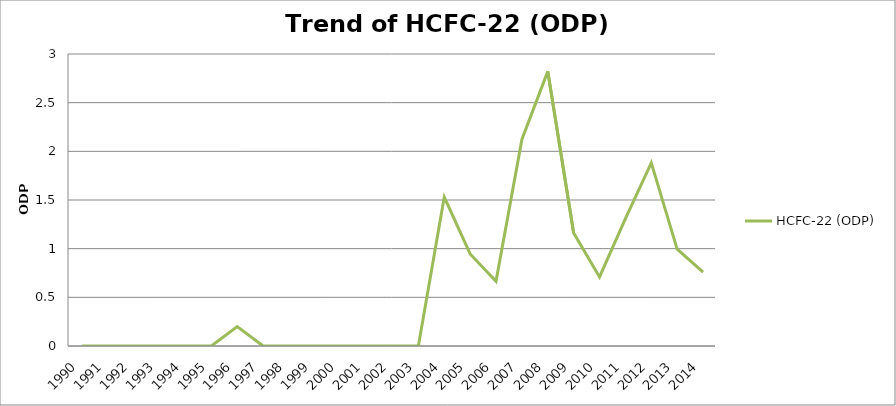
| Category | HCFC-22 (ODP) |
|---|---|
| 1990.0 | 0 |
| 1991.0 | 0 |
| 1992.0 | 0 |
| 1993.0 | 0 |
| 1994.0 | 0 |
| 1995.0 | 0 |
| 1996.0 | 0.2 |
| 1997.0 | 0 |
| 1998.0 | 0 |
| 1999.0 | 0 |
| 2000.0 | 0 |
| 2001.0 | 0 |
| 2002.0 | 0 |
| 2003.0 | 0 |
| 2004.0 | 1.531 |
| 2005.0 | 0.946 |
| 2006.0 | 0.664 |
| 2007.0 | 2.123 |
| 2008.0 | 2.822 |
| 2009.0 | 1.16 |
| 2010.0 | 0.71 |
| 2011.0 | 1.309 |
| 2012.0 | 1.881 |
| 2013.0 | 0.994 |
| 2014.0 | 0.76 |